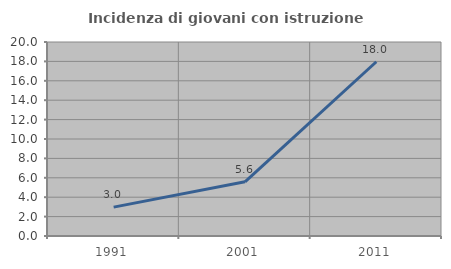
| Category | Incidenza di giovani con istruzione universitaria |
|---|---|
| 1991.0 | 2.976 |
| 2001.0 | 5.584 |
| 2011.0 | 17.964 |